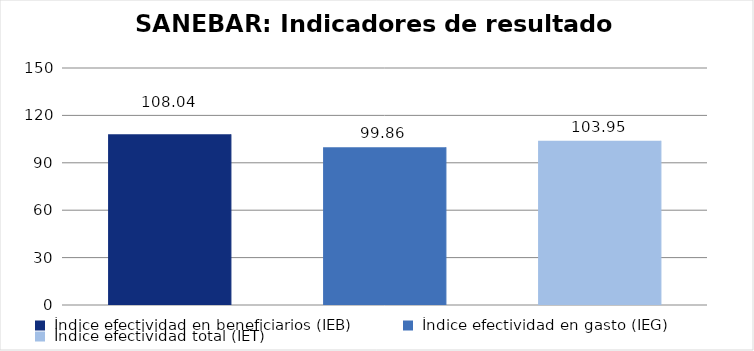
| Category |  Total Programa  |
|---|---|
|  Índice efectividad en beneficiarios (IEB)  | 108.036 |
|  Índice efectividad en gasto (IEG)   | 99.861 |
|  Índice efectividad total (IET)  | 103.949 |